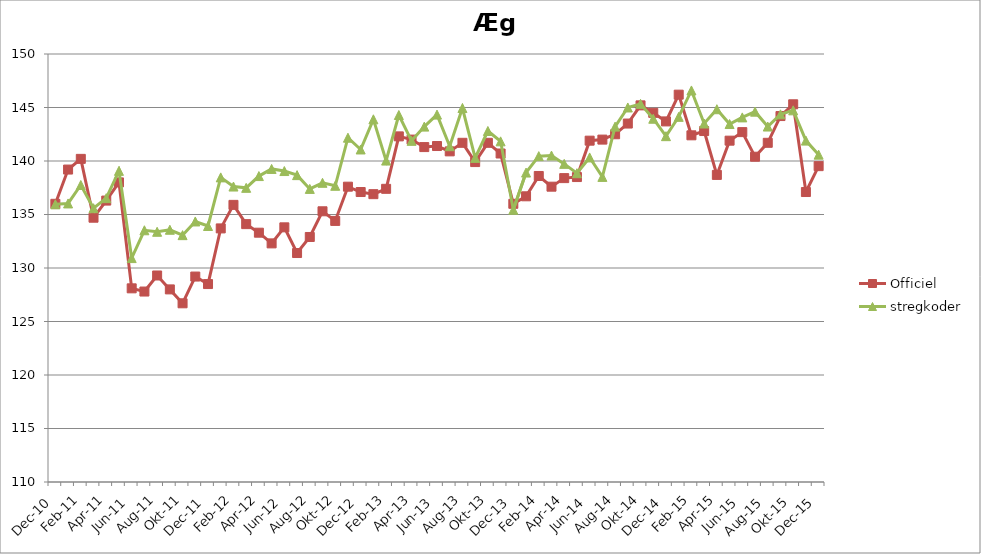
| Category | Officiel | stregkoder |
|---|---|---|
|  Dec-10 | 136 | 135.952 |
|  Jan-11 | 139.2 | 136.033 |
|  Feb-11 | 140.2 | 137.756 |
|  Mar-11 | 134.7 | 135.588 |
|  Apr-11 | 136.3 | 136.528 |
|  Maj-11 | 138 | 139.078 |
|  Jun-11 | 128.1 | 130.927 |
|  Jul-11 | 127.8 | 133.526 |
|  Aug-11 | 129.3 | 133.384 |
|  Sep-11 | 128 | 133.573 |
|  Okt-11 | 126.7 | 133.07 |
|  Nov-11 | 129.2 | 134.349 |
|  Dec-11 | 128.5 | 133.926 |
|  Jan-12 | 133.7 | 138.469 |
|  Feb-12 | 135.9 | 137.614 |
|  Mar-12 | 134.1 | 137.492 |
|  Apr-12 | 133.3 | 138.591 |
|  Maj-12 | 132.3 | 139.259 |
|  Jun-12 | 133.8 | 139.062 |
|  Jul-12 | 131.4 | 138.679 |
|  Aug-12 | 132.9 | 137.392 |
|  Sep-12 | 135.3 | 137.963 |
|  Okt-12 | 134.4 | 137.683 |
|  Nov-12 | 137.6 | 142.176 |
|  Dec-12 | 137.1 | 141.077 |
|  Jan-13 | 136.9 | 143.895 |
|  Feb-13 | 137.4 | 140.04 |
|  Mar-13 | 142.3 | 144.299 |
|  Apr-13 | 142 | 141.883 |
|  Maj-13 | 141.3 | 143.213 |
|  Jun-13 | 141.4 | 144.336 |
|  Jul-13 | 140.9 | 141.382 |
|  Aug-13 | 141.7 | 144.949 |
|  Sep-13 | 139.9 | 140.291 |
|  Okt-13 | 141.7 | 142.805 |
|  Nov-13 | 140.7 | 141.836 |
|  Dec-13 | 136 | 135.44 |
|  Jan-14 | 136.7 | 138.92 |
|  Feb-14 | 138.6 | 140.455 |
|  Mar-14 | 137.6 | 140.507 |
|  Apr-14 | 138.4 | 139.731 |
|  Maj-14 | 138.5 | 138.859 |
|  Jun-14 | 141.9 | 140.332 |
|  Jul-14 | 142 | 138.514 |
|  Aug-14 | 142.5 | 143.214 |
|  Sep-14 | 143.5 | 145.002 |
|  Okt-14 | 145.2 | 145.341 |
|  Nov-14 | 144.5 | 143.95 |
|  Dec-14 | 143.7 | 142.32 |
|  Jan-15 | 146.2 | 144.126 |
|  Feb-15 | 142.4 | 146.593 |
|  Mar-15 | 142.8 | 143.503 |
|  Apr-15 | 138.7 | 144.839 |
|  Maj-15 | 141.9 | 143.456 |
| Jun-15 | 142.7 | 144.076 |
| Jul-15 | 140.4 | 144.611 |
| Aug-15 | 141.7 | 143.221 |
| Sep-15 | 144.2 | 144.361 |
| Okt-15 | 145.3 | 144.735 |
| Nov-15 | 137.1 | 141.904 |
| Dec-15 | 139.519 | 140.593 |